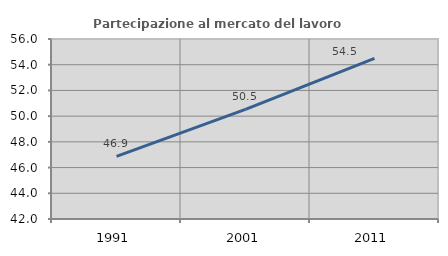
| Category | Partecipazione al mercato del lavoro  femminile |
|---|---|
| 1991.0 | 46.869 |
| 2001.0 | 50.528 |
| 2011.0 | 54.495 |